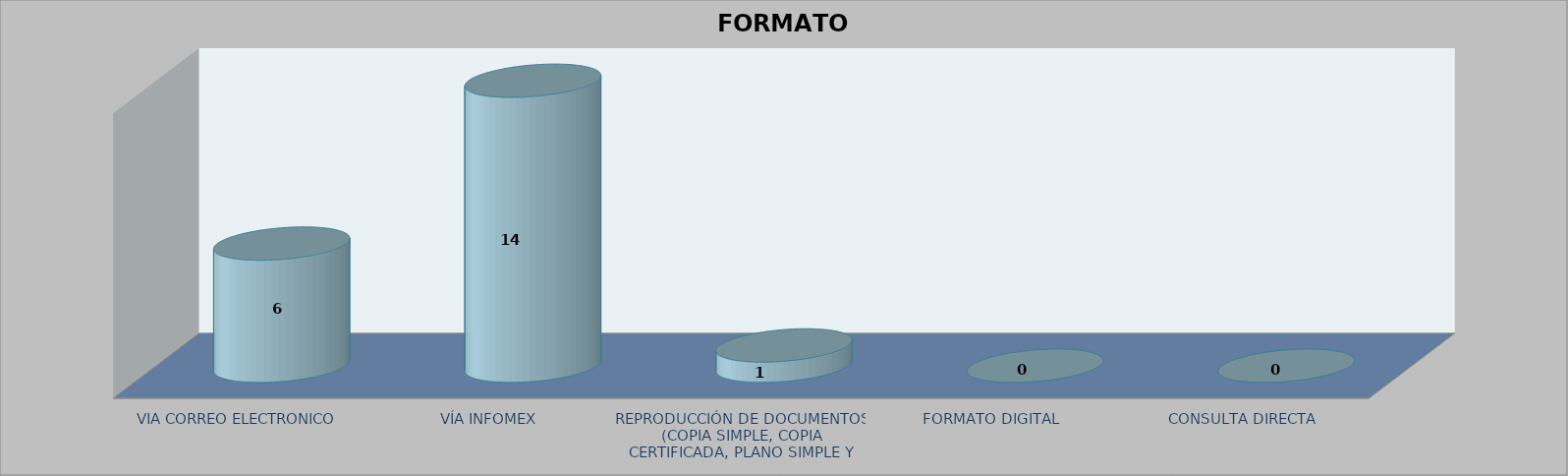
| Category |        FORMATO SOLICITADO | Series 1 | Series 2 |
|---|---|---|---|
| VIA CORREO ELECTRONICO |  |  | 6 |
| VÍA INFOMEX |  |  | 14 |
| REPRODUCCIÓN DE DOCUMENTOS (COPIA SIMPLE, COPIA CERTIFICADA, PLANO SIMPLE Y PLANO CERTIFICADO) |  |  | 1 |
| FORMATO DIGITAL |  |  | 0 |
| CONSULTA DIRECTA |  |  | 0 |